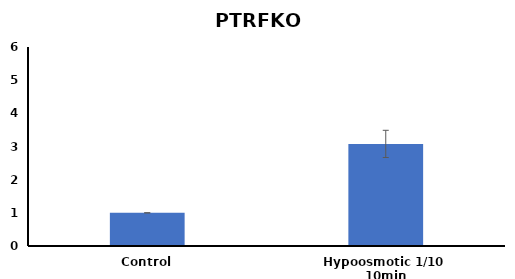
| Category | PTRFKO MEFs |
|---|---|
| Control | 1 |
| Hypoosmotic 1/10  10min | 3.078 |